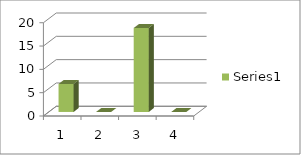
| Category | Series 0 |
|---|---|
| 0 | 6 |
| 1 | 0 |
| 2 | 18 |
| 3 | 0 |